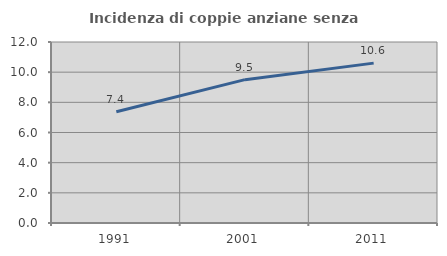
| Category | Incidenza di coppie anziane senza figli  |
|---|---|
| 1991.0 | 7.375 |
| 2001.0 | 9.503 |
| 2011.0 | 10.6 |